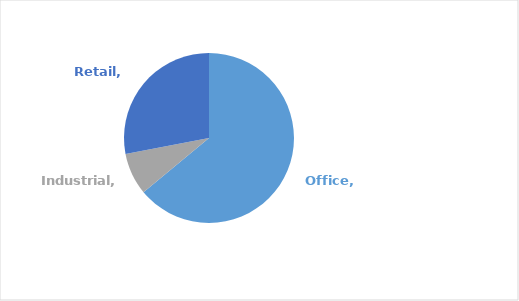
| Category | Series 0 |
|---|---|
| Office | 0.64 |
| Industrial | 0.08 |
| Retail | 0.28 |